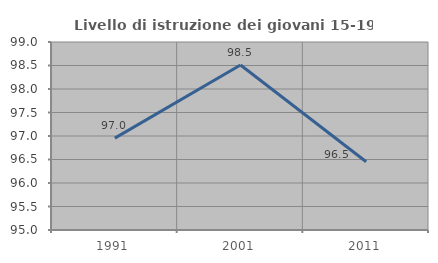
| Category | Livello di istruzione dei giovani 15-19 anni |
|---|---|
| 1991.0 | 96.956 |
| 2001.0 | 98.512 |
| 2011.0 | 96.452 |